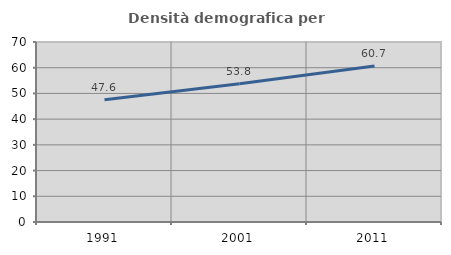
| Category | Densità demografica |
|---|---|
| 1991.0 | 47.562 |
| 2001.0 | 53.807 |
| 2011.0 | 60.653 |